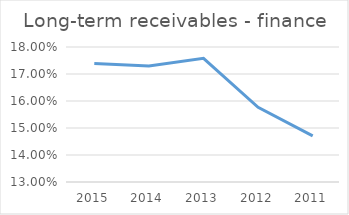
| Category | Long-term receivables - finance |
|---|---|
| 2015.0 | 0.174 |
| 2014.0 | 0.173 |
| 2013.0 | 0.176 |
| 2012.0 | 0.158 |
| 2011.0 | 0.147 |